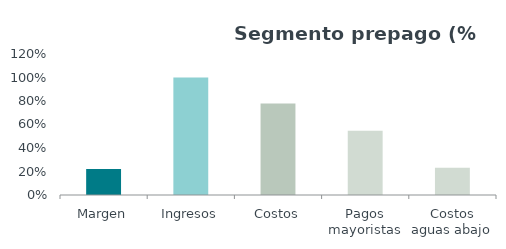
| Category | Series 0 |
|---|---|
| Margen | 0.221 |
| Ingresos | 1 |
| Costos | 0.779 |
| Pagos mayoristas | 0.547 |
| Costos aguas abajo | 0.232 |